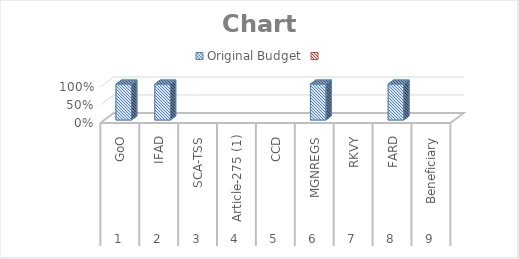
| Category | Original Budget | Series 1 |
|---|---|---|
| 0 | 104223974.268 |  |
| 1 | 80575693.333 |  |
| 2 | 0 |  |
| 3 | 0 |  |
| 4 | 0 |  |
| 5 | 85321300 |  |
| 6 | 0 |  |
| 7 | 75000000 |  |
| 8 | 0 |  |